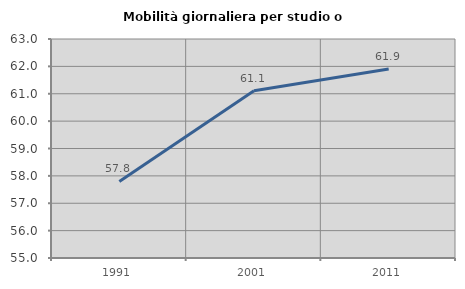
| Category | Mobilità giornaliera per studio o lavoro |
|---|---|
| 1991.0 | 57.795 |
| 2001.0 | 61.106 |
| 2011.0 | 61.9 |